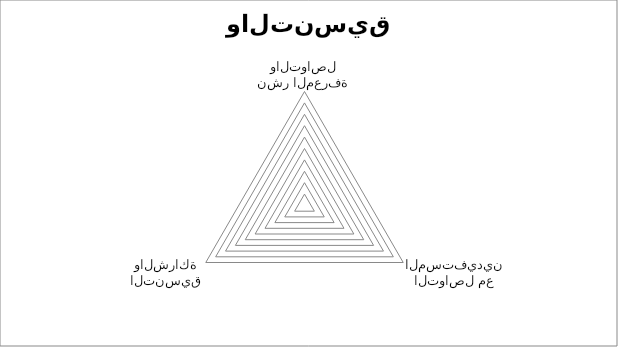
| Category | Series 0 |
|---|---|
| نشر المعرفة والتواصل | 0 |
| التواصل مع المستفيدين | 0 |
| التنسيق والشراكة | 0 |